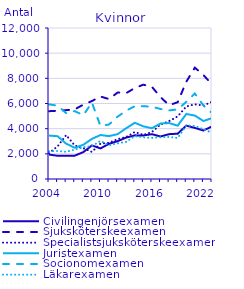
| Category | Civilingenjörsexamen                               | Sjuksköterskeexamen                                | Specialistsjuksköterskeexamen                      | Juristexamen                                       | Socionomexamen                                     | Läkarexamen                                        |
|---|---|---|---|---|---|---|
| 2004.0 | 1943 | 5389 | 2050 | 3452 | 5932 | 2200 |
| 2005.0 | 1845 | 5421 | 2597 | 3401 | 5830 | 2227 |
| 2006.0 | 1845 | 5472 | 3488 | 2808 | 5237 | 2158 |
| 2007.0 | 1855 | 5538 | 2666 | 2479 | 5394 | 2334 |
| 2008.0 | 2138 | 5907 | 2443 | 2718 | 5070 | 2526 |
| 2009.0 | 2666 | 6195 | 2153 | 3188 | 6074 | 2612 |
| 2010.0 | 2431 | 6556 | 2808 | 3494 | 4210 | 3023 |
| 2011.0 | 2797 | 6351 | 2879 | 3407 | 4335 | 2688 |
| 2012.0 | 3006 | 6873 | 3168 | 3564 | 4953 | 2836 |
| 2013.0 | 3292 | 6826 | 3343 | 4036 | 5436 | 2951 |
| 2014.0 | 3468 | 7229 | 3736 | 4468 | 5780 | 3411 |
| 2015.0 | 3461 | 7497 | 3499 | 4184 | 5787 | 3311 |
| 2016.0 | 3562 | 7321 | 3738 | 4036 | 5745 | 3263 |
| 2017.0 | 3378 | 6502 | 4332 | 4410 | 5564 | 3323 |
| 2018.0 | 3563 | 5866 | 4601 | 4448 | 5451 | 3343 |
| 2019.0 | 3602 | 6102 | 4976 | 4237 | 5528 | 3254 |
| 2020.0 | 4242 | 7722 | 5757 | 5166 | 6133 | 4250 |
| 2021.0 | 4061 | 8850 | 5938 | 5041 | 6791 | 4218 |
| 2022.0 | 3853 | 8263 | 5839 | 4608 | 5841 | 3953 |
| 2023.0 | 4175 | 7507 | 6133 | 4840 | 5246 | 3682 |